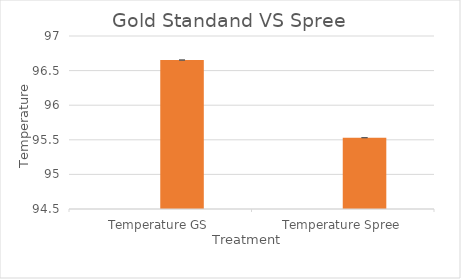
| Category | Series 0 | Series 1 |
|---|---|---|
| Temperature GS |  | 96.653 |
| Temperature Spree |  | 95.531 |